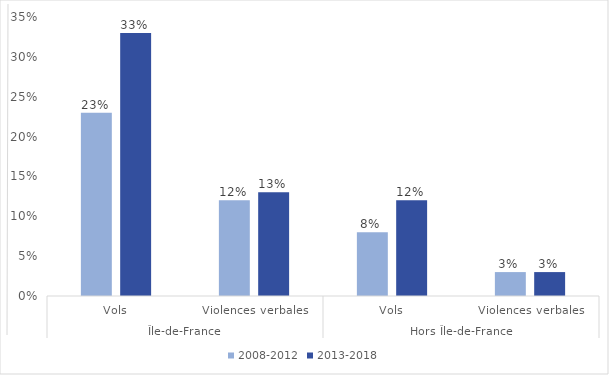
| Category | 2008-2012 | 2013-2018 |
|---|---|---|
| 0 | 0.23 | 0.33 |
| 1 | 0.12 | 0.13 |
| 2 | 0.08 | 0.12 |
| 3 | 0.03 | 0.03 |